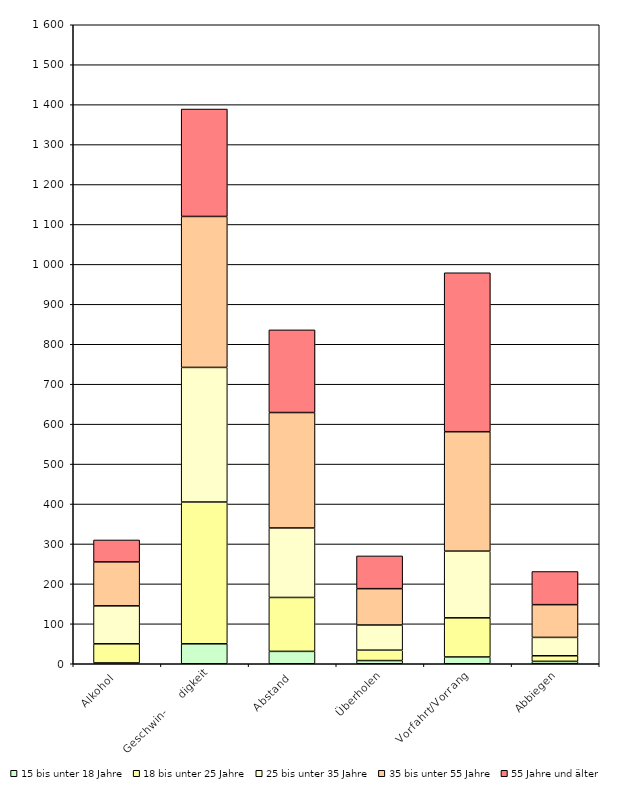
| Category |    15 bis unter 18 Jahre |    18 bis unter 25 Jahre |    25 bis unter 35 Jahre |    35 bis unter 55 Jahre |    55 Jahre und älter |
|---|---|---|---|---|---|
| 0 | 2 | 48 | 95 | 110 | 55 |
| 1 | 50 | 355 | 337 | 378 | 269 |
| 2 | 31 | 135 | 174 | 289 | 207 |
| 3 | 8 | 26 | 63 | 91 | 82 |
| 4 | 17 | 98 | 167 | 299 | 398 |
| 5 | 6 | 14 | 46 | 82 | 83 |